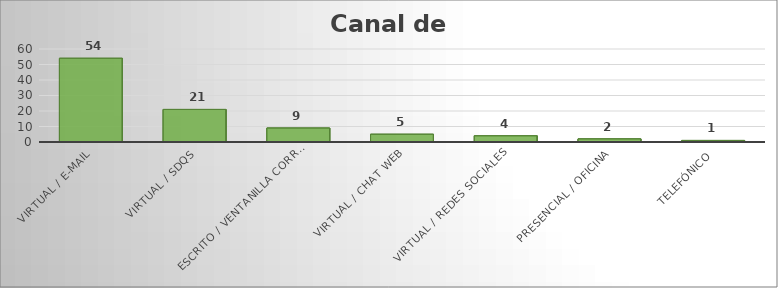
| Category | Series 0 |
|---|---|
| VIRTUAL / E-MAIL | 54 |
| VIRTUAL / SDQS | 21 |
| ESCRITO / VENTANILLA CORRESPONDENCIA | 9 |
| VIRTUAL / CHAT WEB | 5 |
| VIRTUAL / REDES SOCIALES | 4 |
| PRESENCIAL / OFICINA | 2 |
| TELEFÓNICO | 1 |